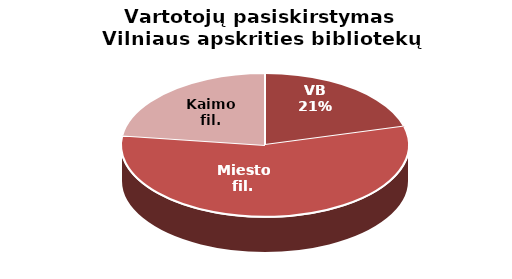
| Category | Series 0 |
|---|---|
| VB | 21834 |
| Miesto fil. | 58704 |
| Kaimo fil. | 23907 |